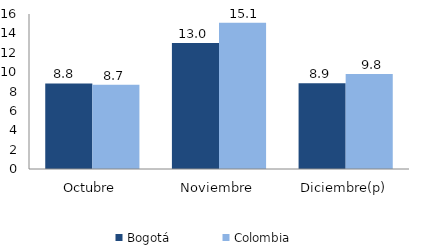
| Category | Bogotá | Colombia |
|---|---|---|
| Octubre | 8.835 | 8.701 |
| Noviembre | 13.015 | 15.086 |
| Diciembre(p) | 8.862 | 9.8 |